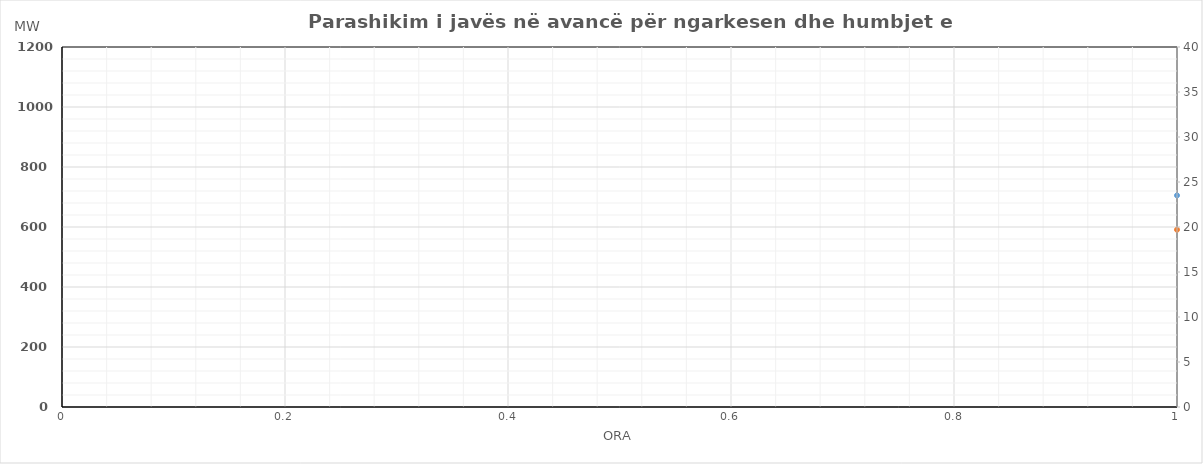
| Category | Ngarkesa (MWh) |
|---|---|
| 0 | 590.8 |
| 1 | 534.57 |
| 2 | 510.32 |
| 3 | 505.25 |
| 4 | 510.67 |
| 5 | 555.63 |
| 6 | 679.26 |
| 7 | 821.77 |
| 8 | 853.04 |
| 9 | 866.95 |
| 10 | 825.23 |
| 11 | 809.41 |
| 12 | 796 |
| 13 | 834.22 |
| 14 | 850.69 |
| 15 | 857.46 |
| 16 | 818.11 |
| 17 | 861.44 |
| 18 | 888.95 |
| 19 | 946.05 |
| 20 | 984.4 |
| 21 | 942.32 |
| 22 | 832.92 |
| 23 | 704.33 |
| 24 | 591.7 |
| 25 | 538.43 |
| 26 | 524.81 |
| 27 | 525.4 |
| 28 | 524.3 |
| 29 | 559.6 |
| 30 | 673.9 |
| 31 | 820.49 |
| 32 | 862.19 |
| 33 | 856.2 |
| 34 | 794.02 |
| 35 | 788.16 |
| 36 | 768.42 |
| 37 | 792.53 |
| 38 | 824.16 |
| 39 | 822.72 |
| 40 | 809.16 |
| 41 | 831.82 |
| 42 | 866.12 |
| 43 | 910.79 |
| 44 | 977.5 |
| 45 | 919.6 |
| 46 | 808.5 |
| 47 | 682.59 |
| 48 | 582.4 |
| 49 | 531.57 |
| 50 | 510.16 |
| 51 | 508.42 |
| 52 | 513.37 |
| 53 | 553.13 |
| 54 | 669.07 |
| 55 | 821.29 |
| 56 | 868.95 |
| 57 | 858.94 |
| 58 | 790.73 |
| 59 | 783.4 |
| 60 | 770.79 |
| 61 | 781.59 |
| 62 | 795.88 |
| 63 | 793.9 |
| 64 | 792.97 |
| 65 | 825.26 |
| 66 | 871.54 |
| 67 | 920.39 |
| 68 | 968.43 |
| 69 | 904.33 |
| 70 | 784.56 |
| 71 | 672.62 |
| 72 | 586.28 |
| 73 | 535.03 |
| 74 | 527.64 |
| 75 | 525.26 |
| 76 | 522.53 |
| 77 | 552.65 |
| 78 | 669.9 |
| 79 | 818.91 |
| 80 | 860.02 |
| 81 | 844.42 |
| 82 | 779.66 |
| 83 | 769.34 |
| 84 | 761.12 |
| 85 | 784.79 |
| 86 | 799.58 |
| 87 | 789.65 |
| 88 | 780.14 |
| 89 | 800.15 |
| 90 | 833.54 |
| 91 | 880.49 |
| 92 | 950.56 |
| 93 | 901 |
| 94 | 790.67 |
| 95 | 665.15 |
| 96 | 577.19 |
| 97 | 524.6 |
| 98 | 516.84 |
| 99 | 518.61 |
| 100 | 518.41 |
| 101 | 546.62 |
| 102 | 663.11 |
| 103 | 803.7 |
| 104 | 836.59 |
| 105 | 824.94 |
| 106 | 760.22 |
| 107 | 744.95 |
| 108 | 730.39 |
| 109 | 745.26 |
| 110 | 768.94 |
| 111 | 767.13 |
| 112 | 766.9 |
| 113 | 783.45 |
| 114 | 820.23 |
| 115 | 877.2 |
| 116 | 947.78 |
| 117 | 898.46 |
| 118 | 800.22 |
| 119 | 685.22 |
| 120 | 574.94 |
| 121 | 525.32 |
| 122 | 511 |
| 123 | 507.92 |
| 124 | 507.88 |
| 125 | 542.76 |
| 126 | 636.26 |
| 127 | 749.71 |
| 128 | 825.85 |
| 129 | 836.55 |
| 130 | 832.39 |
| 131 | 824.45 |
| 132 | 818.46 |
| 133 | 813.72 |
| 134 | 793.96 |
| 135 | 774.66 |
| 136 | 772.62 |
| 137 | 784.73 |
| 138 | 808.78 |
| 139 | 859.82 |
| 140 | 922.48 |
| 141 | 852.5 |
| 142 | 737.8 |
| 143 | 652.97 |
| 144 | 593.84 |
| 145 | 544.22 |
| 146 | 510.7 |
| 147 | 489.12 |
| 148 | 489.78 |
| 149 | 517.36 |
| 150 | 577.86 |
| 151 | 663.01 |
| 152 | 750.65 |
| 153 | 802.65 |
| 154 | 813.69 |
| 155 | 811.35 |
| 156 | 816.96 |
| 157 | 803.12 |
| 158 | 771.86 |
| 159 | 741.66 |
| 160 | 742.92 |
| 161 | 766.93 |
| 162 | 802.48 |
| 163 | 861.12 |
| 164 | 921.08 |
| 165 | 875.4 |
| 166 | 770.2 |
| 167 | 653.37 |